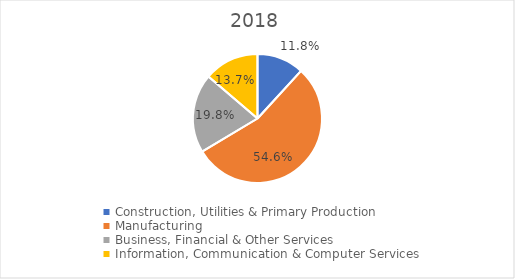
| Category | Series 0 |
|---|---|
| Construction, Utilities & Primary Production  | 0.118 |
| Manufacturing  | 0.546 |
| Business, Financial & Other Services | 0.198 |
| Information, Communication & Computer Services | 0.137 |